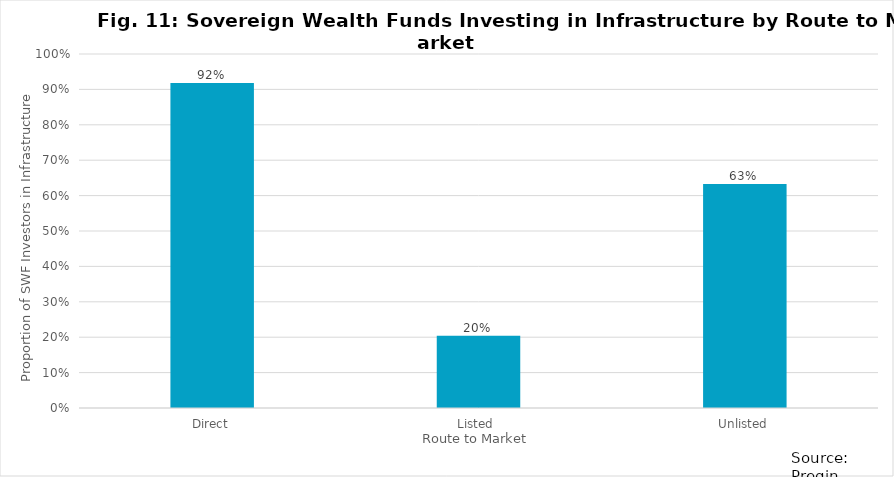
| Category | Series 0 |
|---|---|
| Direct | 0.918 |
| Listed  | 0.204 |
| Unlisted | 0.633 |